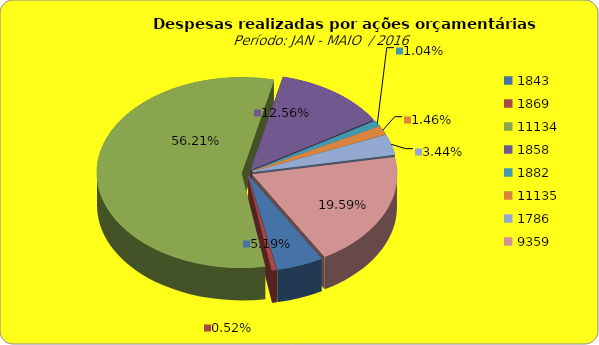
| Category | Series 1 |
|---|---|
| 1843.0 | 5490058.22 |
| 1869.0 | 545858.29 |
| 11134.0 | 59431767.38 |
| 1858.0 | 13284287.59 |
| 1882.0 | 1097555.3 |
| 11135.0 | 1539543.79 |
| 1786.0 | 3640575.76 |
| 9359.0 | 20708893.3 |